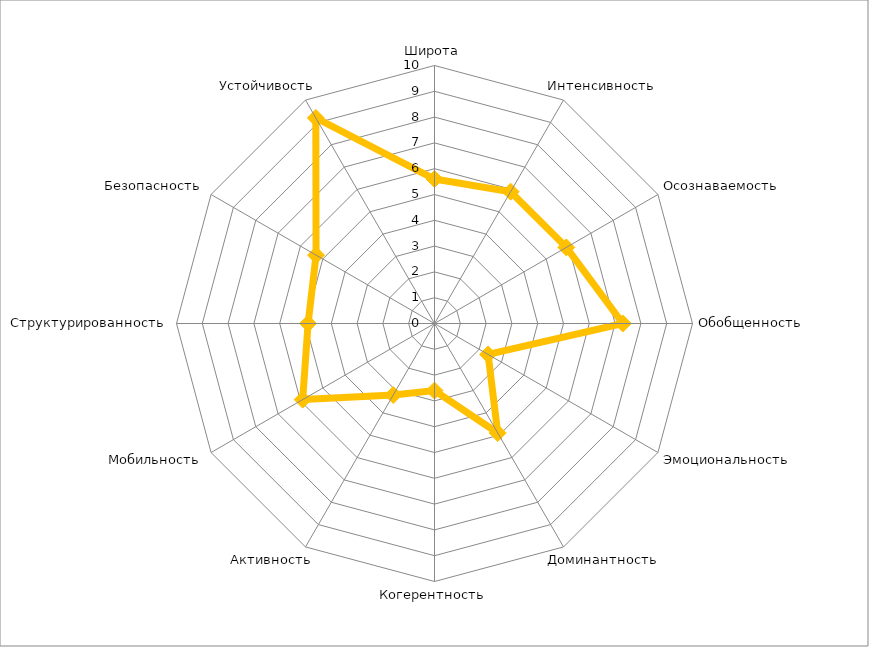
| Category | Series 0 |
|---|---|
| Широта | 5.6 |
| Интенсивность | 5.9 |
| Осознаваемость | 5.9 |
| Обобщенность | 7.3 |
| Эмоциональность | 2.4 |
| Доминантность | 4.9 |
| Когерентность | 2.6 |
| Активность | 3.2 |
| Мобильность | 5.9 |
| Структурированность | 4.9 |
| Безопасность | 5.3 |
| Устойчивость | 9.2 |